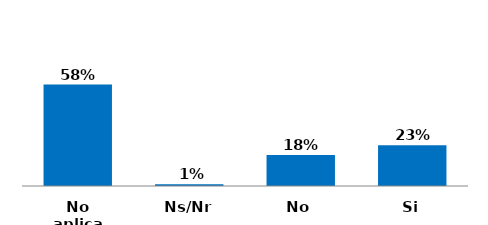
| Category | Series 0 |
|---|---|
| Si | 0.233 |
| No | 0.177 |
| Ns/Nr | 0.01 |
| No aplica | 0.58 |